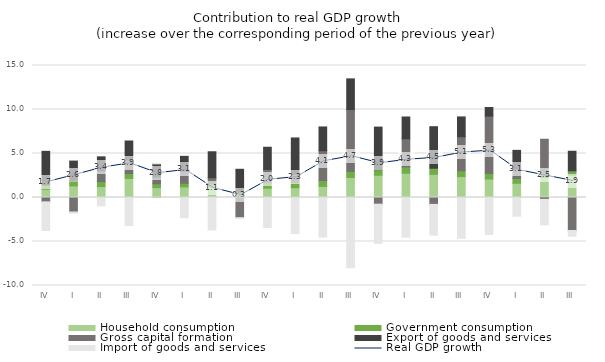
| Category | Household consumption | Government consumption | Gross capital formation | Export of goods and services | Import of goods and services |
|---|---|---|---|---|---|
| IV | 0.942 | 0.471 | -0.494 | 3.832 | -3.257 |
| I | 1.316 | 0.534 | -1.648 | 2.287 | -0.128 |
| II | 1.246 | 0.556 | 1.217 | 1.602 | -0.949 |
| III | 2.174 | 0.555 | 1.539 | 2.154 | -3.18 |
| IV | 1.125 | 0.436 | 0.756 | 1.507 | 0.049 |
| I | 1.207 | 0.407 | 1.386 | 1.678 | -2.297 |
| II | 1.183 | 0.401 | 0.661 | 2.953 | -3.693 |
| III | 0.131 | 0.464 | -2.289 | 2.611 | -0.018 |
| IV | 1.054 | 0.617 | 1.525 | 2.515 | -3.403 |
| I | 1.114 | 0.616 | 0.894 | 4.141 | -4.09 |
| II | 1.261 | 0.675 | 3.382 | 2.7 | -4.493 |
| III | 2.278 | 0.685 | 7.034 | 3.484 | -7.979 |
| IV | 2.53 | 0.637 | -0.759 | 4.833 | -4.453 |
| I | 2.759 | 0.712 | 3.199 | 2.479 | -4.507 |
| II | 2.632 | 0.695 | -0.782 | 4.719 | -3.499 |
| III | 2.377 | 0.659 | 3.869 | 2.252 | -4.638 |
| IV | 2.106 | 0.639 | 6.506 | 0.974 | -4.192 |
| I | 1.617 | 0.538 | 1.088 | 2.114 | -2.124 |
| II | 2.268 | 0.503 | 3.849 | -0.18 | -2.919 |
| III | 2.516 | 0.515 | -3.751 | 2.222 | -0.658 |